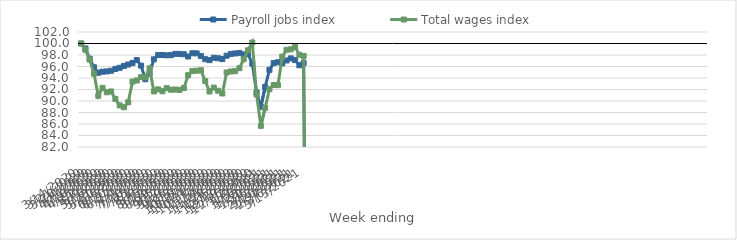
| Category | Payroll jobs index | Total wages index |
|---|---|---|
| 14/03/2020 | 100 | 100 |
| 21/03/2020 | 99.134 | 98.912 |
| 28/03/2020 | 97.36 | 97.194 |
| 04/04/2020 | 95.858 | 94.752 |
| 11/04/2020 | 94.916 | 90.906 |
| 18/04/2020 | 95.094 | 92.281 |
| 25/04/2020 | 95.143 | 91.514 |
| 02/05/2020 | 95.264 | 91.66 |
| 09/05/2020 | 95.57 | 90.362 |
| 16/05/2020 | 95.776 | 89.238 |
| 23/05/2020 | 96.094 | 88.915 |
| 30/05/2020 | 96.346 | 89.773 |
| 06/06/2020 | 96.62 | 93.38 |
| 13/06/2020 | 97.114 | 93.57 |
| 20/06/2020 | 96.149 | 94.162 |
| 27/06/2020 | 93.78 | 94.109 |
| 04/07/2020 | 94.823 | 95.67 |
| 11/07/2020 | 97.246 | 91.661 |
| 18/07/2020 | 97.983 | 92.024 |
| 25/07/2020 | 97.996 | 91.699 |
| 01/08/2020 | 97.948 | 92.226 |
| 08/08/2020 | 97.98 | 91.959 |
| 15/08/2020 | 98.201 | 91.992 |
| 22/08/2020 | 98.182 | 91.935 |
| 29/08/2020 | 98.132 | 92.256 |
| 05/09/2020 | 97.738 | 94.484 |
| 12/09/2020 | 98.3 | 95.198 |
| 19/09/2020 | 98.285 | 95.268 |
| 26/09/2020 | 97.814 | 95.341 |
| 03/10/2020 | 97.267 | 93.479 |
| 10/10/2020 | 97.108 | 91.659 |
| 17/10/2020 | 97.518 | 92.333 |
| 24/10/2020 | 97.436 | 91.789 |
| 31/10/2020 | 97.291 | 91.308 |
| 07/11/2020 | 97.873 | 94.964 |
| 14/11/2020 | 98.189 | 95.136 |
| 21/11/2020 | 98.269 | 95.185 |
| 28/11/2020 | 98.335 | 95.715 |
| 05/12/2020 | 98.098 | 97.266 |
| 12/12/2020 | 98.153 | 98.826 |
| 19/12/2020 | 96.495 | 100.162 |
| 26/12/2020 | 91.467 | 91.134 |
| 02/01/2021 | 88.996 | 85.679 |
| 09/01/2021 | 92.443 | 88.789 |
| 16/01/2021 | 95.415 | 92.057 |
| 23/01/2021 | 96.591 | 92.776 |
| 30/01/2021 | 96.742 | 92.754 |
| 06/02/2021 | 96.539 | 97.712 |
| 13/02/2021 | 97.044 | 98.902 |
| 20/02/2021 | 97.41 | 98.993 |
| 27/02/2021 | 97.108 | 99.371 |
| 06/03/2021 | 96.21 | 98.031 |
| 13/03/2021 | 96.598 | 97.832 |